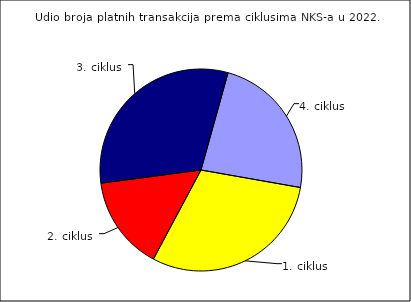
| Category | Series 0 |
|---|---|
| 1. ciklus | 70775189 |
| 2. ciklus | 35575630 |
| 3. ciklus | 74023758 |
| 4. ciklus | 55273092 |